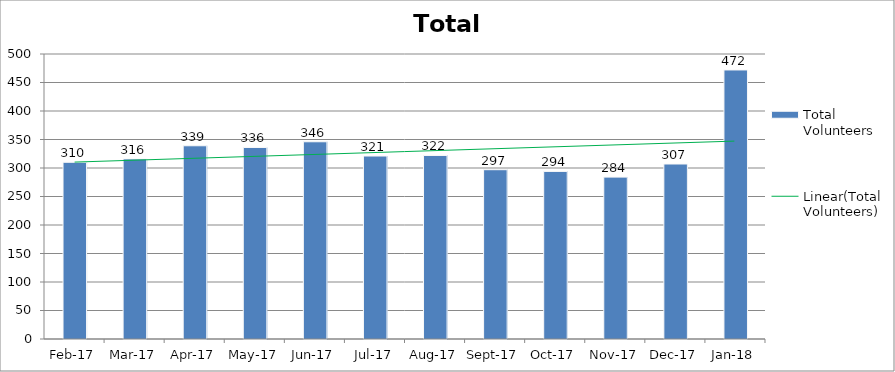
| Category | Total Volunteers |
|---|---|
| 2017-02-01 | 310 |
| 2017-03-01 | 316 |
| 2017-04-01 | 339 |
| 2017-05-01 | 336 |
| 2017-06-01 | 346 |
| 2017-07-01 | 321 |
| 2017-08-01 | 322 |
| 2017-09-01 | 297 |
| 2017-10-01 | 294 |
| 2017-11-01 | 284 |
| 2017-12-01 | 307 |
| 2018-01-01 | 472 |